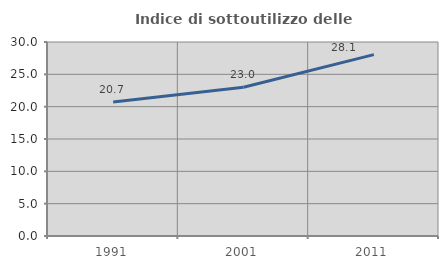
| Category | Indice di sottoutilizzo delle abitazioni  |
|---|---|
| 1991.0 | 20.711 |
| 2001.0 | 22.991 |
| 2011.0 | 28.052 |